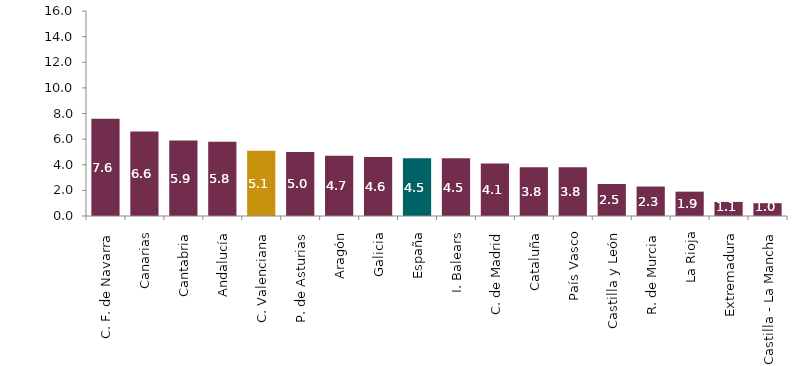
| Category | Vivienda General |
|---|---|
| C. F. de Navarra | 7.6 |
| Canarias | 6.6 |
| Cantabria | 5.9 |
| Andalucía | 5.8 |
| C. Valenciana | 5.1 |
| P. de Asturias | 5 |
| Aragón | 4.7 |
| Galicia | 4.6 |
| España | 4.5 |
| I. Balears | 4.5 |
| C. de Madrid | 4.1 |
| Cataluña | 3.8 |
| País Vasco | 3.8 |
| Castilla y León | 2.5 |
| R. de Murcia | 2.3 |
| La Rioja | 1.9 |
| Extremadura | 1.1 |
| Castilla - La Mancha | 1 |